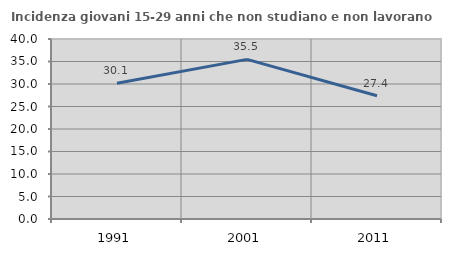
| Category | Incidenza giovani 15-29 anni che non studiano e non lavorano  |
|---|---|
| 1991.0 | 30.147 |
| 2001.0 | 35.467 |
| 2011.0 | 27.396 |